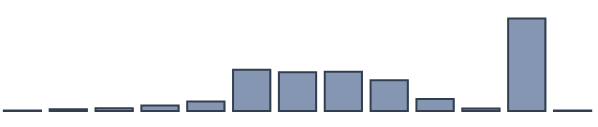
| Category | Series 0 |
|---|---|
| 0 | 0.167 |
| 1 | 0.638 |
| 2 | 0.95 |
| 3 | 1.959 |
| 4 | 3.392 |
| 5 | 14.857 |
| 6 | 13.974 |
| 7 | 14.149 |
| 8 | 11.093 |
| 9 | 4.347 |
| 10 | 0.918 |
| 11 | 33.358 |
| 12 | 0.198 |